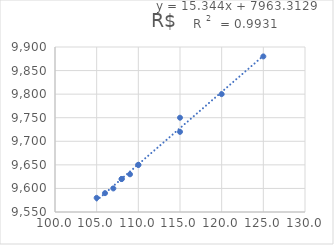
| Category | R$ |
|---|---|
| 125.0 | 9880 |
| 115.0 | 9720 |
| 110.0 | 9650 |
| 108.0 | 9620 |
| 105.0 | 9580 |
| 106.0 | 9590 |
| 107.0 | 9600 |
| 108.0 | 9620 |
| 109.0 | 9630 |
| 110.0 | 9650 |
| 115.0 | 9750 |
| 120.0 | 9800 |